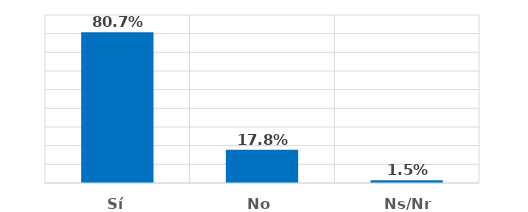
| Category | Series 0 |
|---|---|
| Sí | 0.807 |
| No | 0.178 |
| Ns/Nr | 0.015 |